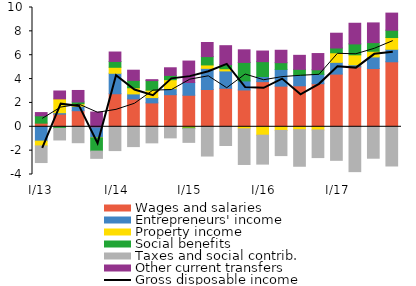
| Category | Wages and salaries | Entrepreneurs' income | Property income | Social benefits  | Taxes and social contrib. | Other current transfers |
|---|---|---|---|---|---|---|
| I/13 | 0.304 | -1.202 | -0.401 | 0.615 | -1.395 | 0.272 |
| II | 1.062 | 0.118 | 1.159 | -0.131 | -0.974 | 0.661 |
| III | 1.348 | 0.371 | 0.212 | 0.15 | -1.334 | 0.963 |
|  IV | -0.071 | -0.861 | -0.007 | -1.099 | -0.606 | 1.237 |
|  I/14 | 2.771 | 1.713 | 0.504 | 0.489 | -1.995 | 0.791 |
| II | 2.338 | 0.418 | 0.516 | 0.619 | -1.661 | 0.853 |
| III | 2.003 | 0.446 | 0.622 | 0.801 | -1.346 | 0.078 |
| IV | 2.689 | 0.515 | 0.744 | 0.361 | -0.929 | 0.639 |
|  I/15 | 2.644 | 1.067 | -0.091 | -0.068 | -1.147 | 1.798 |
| II | 3.127 | 1.772 | 0.285 | 0.699 | -2.453 | 1.182 |
| III | 3.227 | 1.458 | 0.18 | 0.346 | -1.568 | 1.587 |
| IV | 3.087 | 0.757 | -0.172 | 1.551 | -2.987 | 1.055 |
|  I/16 | 3.785 | 0.432 | -0.704 | 1.245 | -2.425 | 0.889 |
| II | 3.407 | 1.403 | -0.302 | 0.565 | -2.114 | 1.041 |
| III | 3.435 | 0.882 | -0.244 | 0.5 | -3.064 | 1.173 |
| IV | 3.61 | 0.786 | -0.267 | 0.381 | -2.316 | 1.363 |
|  I/17 | 4.418 | 0.985 | 0.8 | 0.403 | -2.812 | 1.238 |
| II | 5.026 | 0.173 | 0.835 | 0.916 | -3.76 | 1.73 |
| III | 4.883 | 0.974 | 0.472 | 0.729 | -2.634 | 1.65 |
| IV | 5.449 | 1.051 | 0.981 | 0.615 | -3.286 | 1.435 |